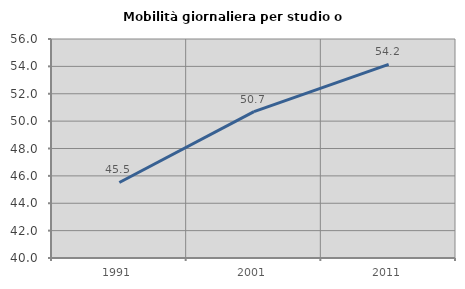
| Category | Mobilità giornaliera per studio o lavoro |
|---|---|
| 1991.0 | 45.517 |
| 2001.0 | 50.699 |
| 2011.0 | 54.152 |